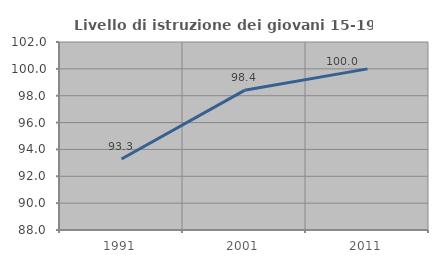
| Category | Livello di istruzione dei giovani 15-19 anni |
|---|---|
| 1991.0 | 93.289 |
| 2001.0 | 98.4 |
| 2011.0 | 100 |